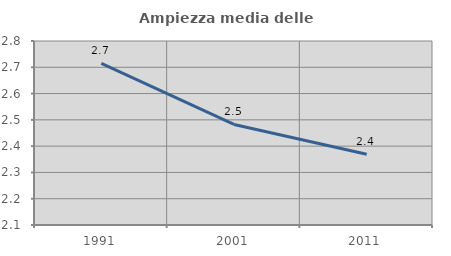
| Category | Ampiezza media delle famiglie |
|---|---|
| 1991.0 | 2.715 |
| 2001.0 | 2.483 |
| 2011.0 | 2.369 |